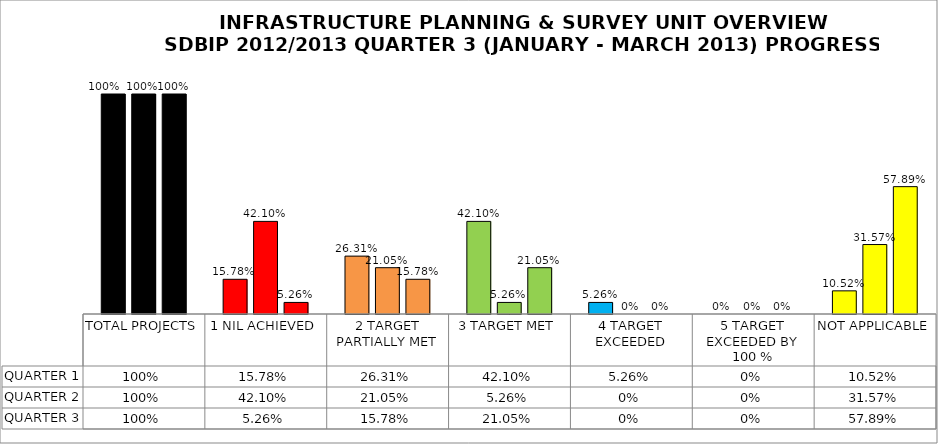
| Category | QUARTER 1 | QUARTER 2 | QUARTER 3 |
|---|---|---|---|
| TOTAL PROJECTS | 1 | 1 | 1 |
| 1 NIL ACHIEVED | 0.158 | 0.421 | 0.053 |
| 2 TARGET PARTIALLY MET | 0.263 | 0.21 | 0.158 |
| 3 TARGET MET | 0.421 | 0.053 | 0.21 |
| 4 TARGET EXCEEDED | 0.053 | 0 | 0 |
| 5 TARGET EXCEEDED BY 100 % | 0 | 0 | 0 |
| NOT APPLICABLE | 0.105 | 0.316 | 0.579 |